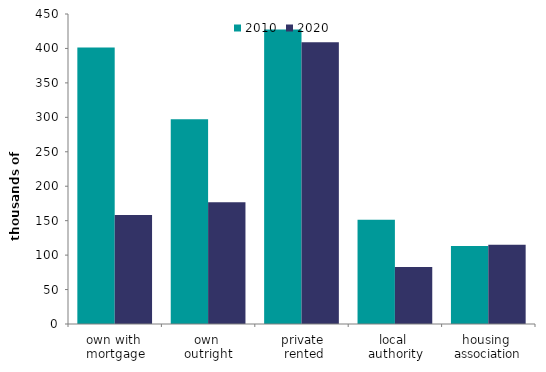
| Category | 2010 | 2020 |
|---|---|---|
| own with 
mortgage | 401.397 | 158.104 |
| own 
outright | 297.329 | 176.647 |
| private
 rented | 427.567 | 409.01 |
| local 
authority | 151.424 | 82.561 |
| housing 
association | 113.067 | 115.12 |